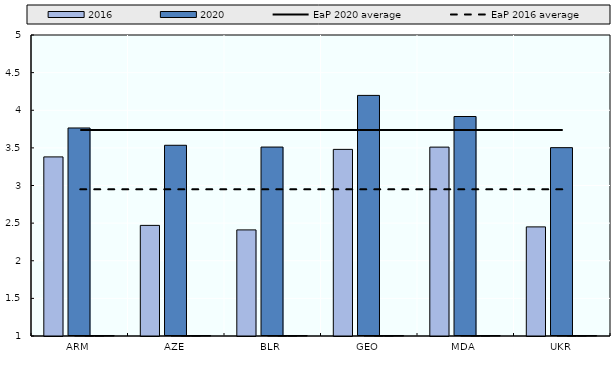
| Category | 2020 | 2020 (according to 2016 methodology) |
|---|---|---|
| ARM | 3.764 | 0 |
| AZE | 3.535 | 0 |
| BLR | 3.511 | 0 |
| GEO | 4.197 | 0 |
| MDA | 3.917 | 0 |
| UKR | 3.503 | 0 |